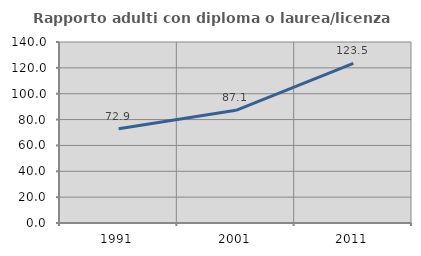
| Category | Rapporto adulti con diploma o laurea/licenza media  |
|---|---|
| 1991.0 | 72.852 |
| 2001.0 | 87.132 |
| 2011.0 | 123.529 |